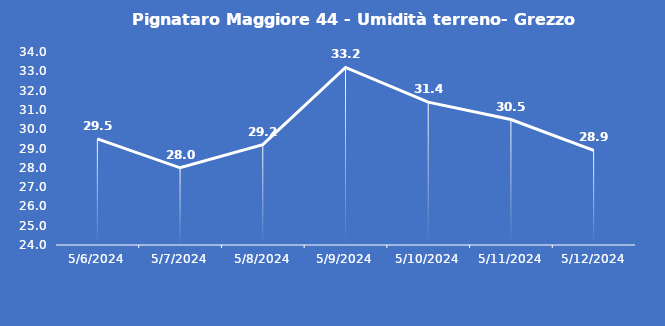
| Category | Pignataro Maggiore 44 - Umidità terreno- Grezzo (%VWC) |
|---|---|
| 5/6/24 | 29.5 |
| 5/7/24 | 28 |
| 5/8/24 | 29.2 |
| 5/9/24 | 33.2 |
| 5/10/24 | 31.4 |
| 5/11/24 | 30.5 |
| 5/12/24 | 28.9 |